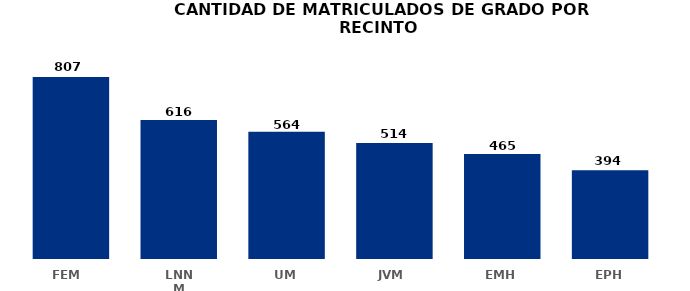
| Category | Series 0 |
|---|---|
| FEM  | 807 |
| LNNM | 616 |
| UM | 564 |
| JVM  | 514 |
| EMH | 465 |
| EPH | 394 |